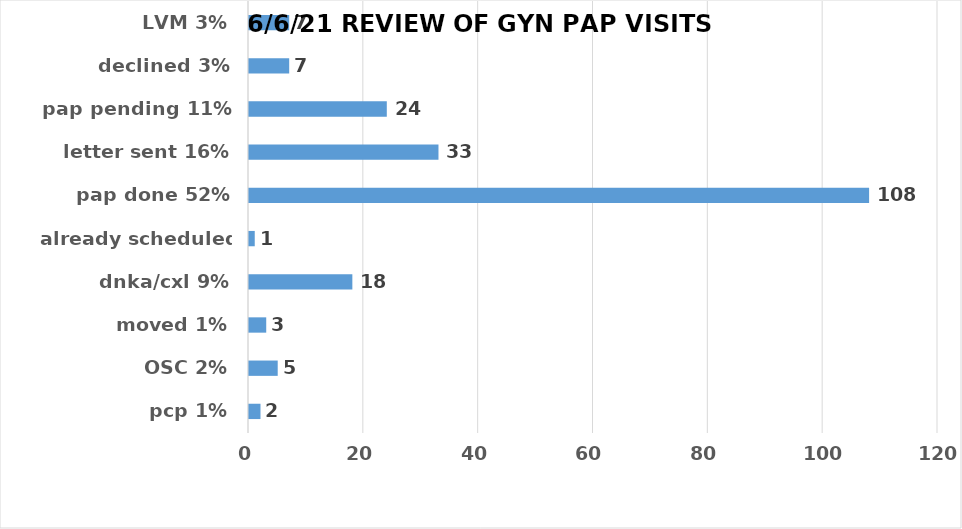
| Category | Series 0 |
|---|---|
| pcp 1% | 2 |
| OSC 2% | 5 |
| moved 1% | 3 |
| dnka/cxl 9% | 18 |
| already scheduled 0.5% | 1 |
| pap done 52% | 108 |
| letter sent 16% | 33 |
| pap pending 11% | 24 |
| declined 3% | 7 |
| LVM 3% | 7 |